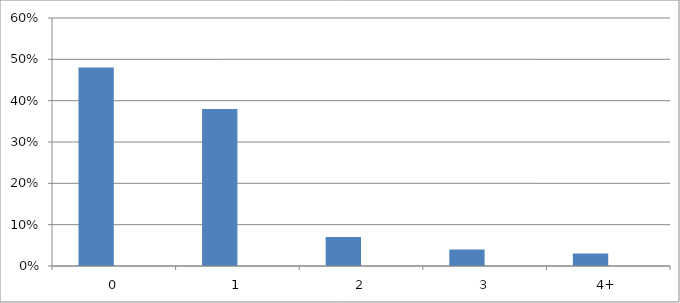
| Category | Series 0 | Series 1 |
|---|---|---|
| 0 | 0.48 | 0 |
| 1 | 0.38 | 0 |
| 2 | 0.07 | 0 |
| 3 | 0.04 | 0 |
| 4+ | 0.03 | 0 |